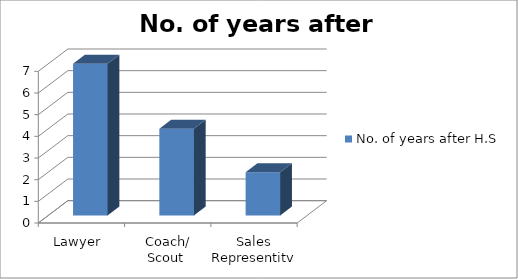
| Category | No. of years after H.S |
|---|---|
| Lawyer  | 7 |
| Coach/ Scout  | 4 |
| Sales Representitve  | 2 |